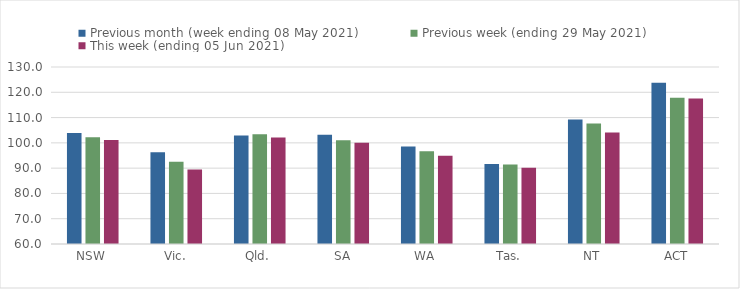
| Category | Previous month (week ending 08 May 2021) | Previous week (ending 29 May 2021) | This week (ending 05 Jun 2021) |
|---|---|---|---|
| NSW | 103.89 | 102.17 | 101.14 |
| Vic. | 96.31 | 92.51 | 89.5 |
| Qld. | 102.94 | 103.43 | 102.13 |
| SA | 103.2 | 101.04 | 100.03 |
| WA | 98.6 | 96.64 | 94.88 |
| Tas. | 91.67 | 91.41 | 90.18 |
| NT | 109.23 | 107.69 | 104.09 |
| ACT | 123.73 | 117.8 | 117.56 |